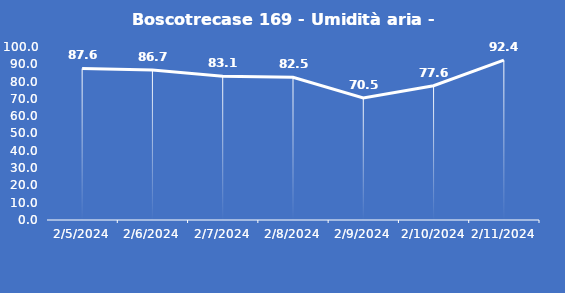
| Category | Boscotrecase 169 - Umidità aria - Grezzo (%) |
|---|---|
| 2/5/24 | 87.6 |
| 2/6/24 | 86.7 |
| 2/7/24 | 83.1 |
| 2/8/24 | 82.5 |
| 2/9/24 | 70.5 |
| 2/10/24 | 77.6 |
| 2/11/24 | 92.4 |